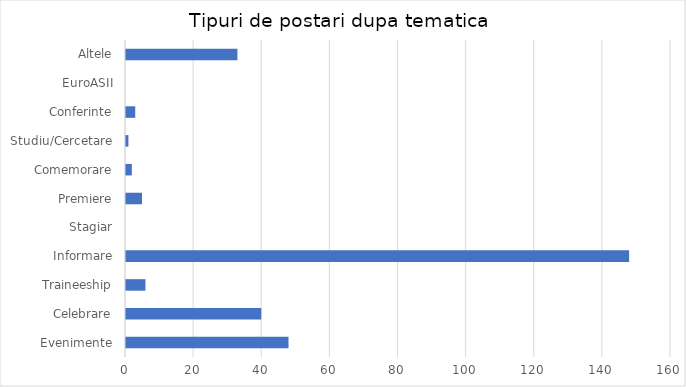
| Category | Series 0 |
|---|---|
| Evenimente | 48 |
| Celebrare | 40 |
| Traineeship | 6 |
| Informare | 148 |
| Stagiar | 0 |
| Premiere | 5 |
| Comemorare | 2 |
| Studiu/Cercetare | 1 |
| Conferinte | 3 |
| EuroASII | 0 |
| Altele | 33 |